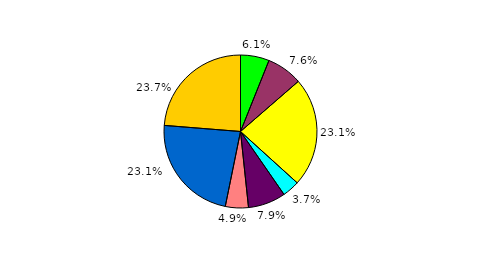
| Category | Series 0 |
|---|---|
| 0 | 6.071 |
| 1 | 7.564 |
| 2 | 23.079 |
| 3 | 3.662 |
| 4 | 7.95 |
| 5 | 4.866 |
| 6 | 23.079 |
| 7 | 23.729 |